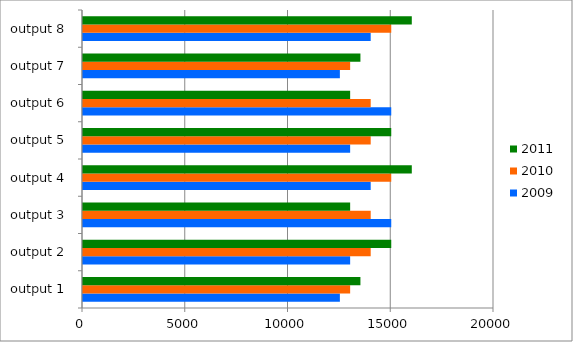
| Category | 2009 | 2010 | 2011 |
|---|---|---|---|
| output 1 | 12500 | 13000 | 13500 |
| output 2 | 13000 | 14000 | 15000 |
| output 3 | 15000 | 14000 | 13000 |
| output 4 | 14000 | 15000 | 16000 |
| output 5 | 13000 | 14000 | 15000 |
| output 6 | 15000 | 14000 | 13000 |
| output 7 | 12500 | 13000 | 13500 |
| output 8 | 14000 | 15000 | 16000 |